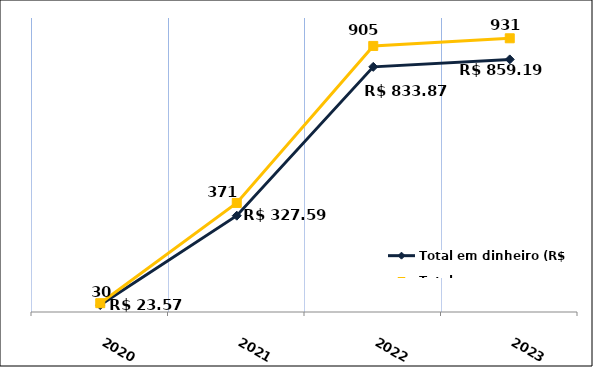
| Category | Total em dinheiro (R$) |
|---|---|
| 2020.0 | 23.57 |
| 2021.0 | 327.59 |
| 2022.0 | 833.87 |
| 2023.0 | 859.19 |